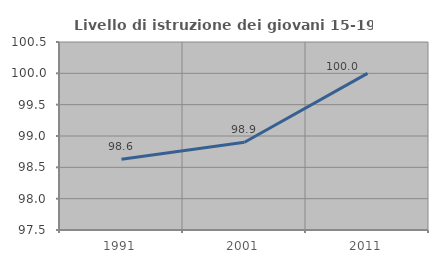
| Category | Livello di istruzione dei giovani 15-19 anni |
|---|---|
| 1991.0 | 98.63 |
| 2001.0 | 98.901 |
| 2011.0 | 100 |